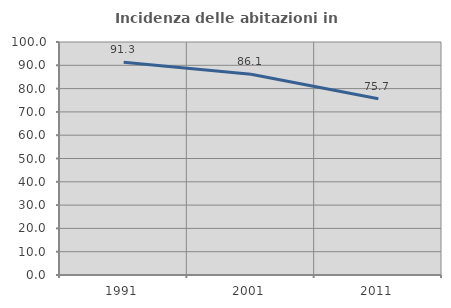
| Category | Incidenza delle abitazioni in proprietà  |
|---|---|
| 1991.0 | 91.319 |
| 2001.0 | 86.122 |
| 2011.0 | 75.676 |